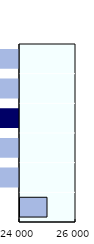
| Category | One | Two-one |
|---|---|---|
|  | 12001 | 12999 |
|  | 8001 | 3999 |
|  | 4001 | 3999 |
|  | 2001 | 1999 |
|  | 1001 | 999 |
|  | 200 | 800 |